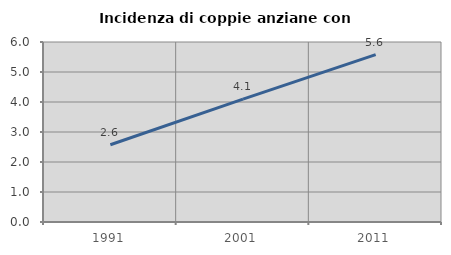
| Category | Incidenza di coppie anziane con figli |
|---|---|
| 1991.0 | 2.575 |
| 2001.0 | 4.098 |
| 2011.0 | 5.577 |